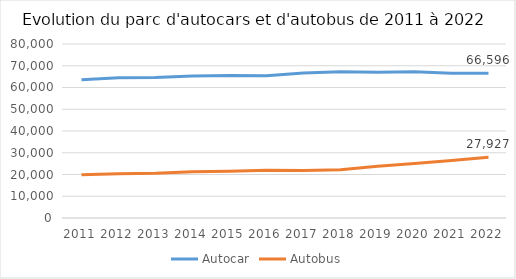
| Category | Autocar | Autobus |
|---|---|---|
| 2011.0 | 63538 | 19935 |
| 2012.0 | 64507 | 20379 |
| 2013.0 | 64562 | 20567 |
| 2014.0 | 65313 | 21261 |
| 2015.0 | 65539 | 21445 |
| 2016.0 | 65356 | 21995 |
| 2017.0 | 66658 | 21857 |
| 2018.0 | 67249 | 22208 |
| 2019.0 | 66972 | 23798 |
| 2020.0 | 67258 | 25039 |
| 2021.0 | 66519 | 26399 |
| 2022.0 | 66596 | 27927 |